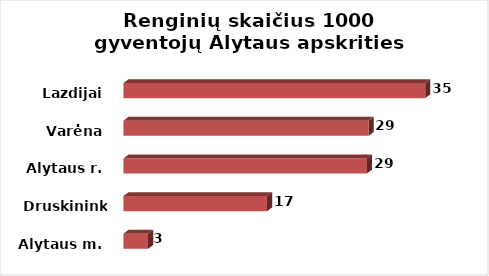
| Category | Series 0 |
|---|---|
| Alytaus m. | 2.895 |
| Druskininkai | 16.885 |
| Alytaus r. | 28.607 |
| Varėna | 28.817 |
| Lazdijai | 35.459 |